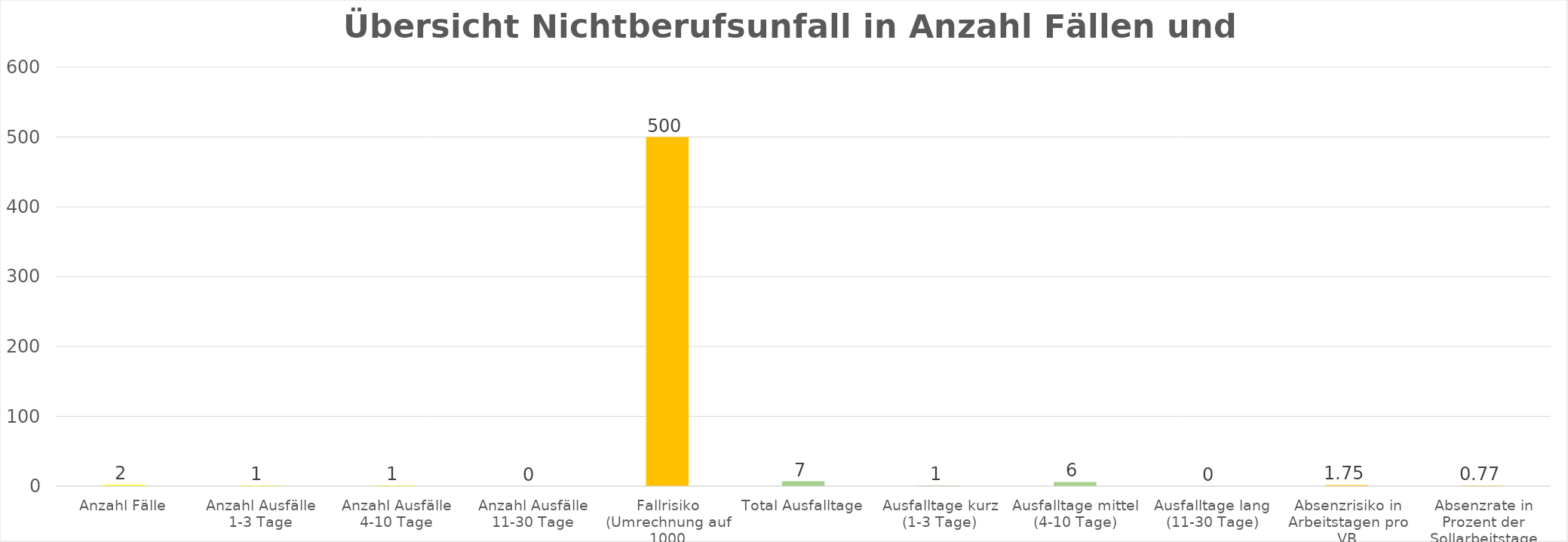
| Category | Nichtberufsunfall  |
|---|---|
| Anzahl Fälle | 2 |
| Anzahl Ausfälle 1-3 Tage | 1 |
| Anzahl Ausfälle 4-10 Tage | 1 |
| Anzahl Ausfälle 11-30 Tage | 0 |
| Fallrisiko (Umrechnung auf 1000 Vollbeschäftigte) | 500 |
| Total Ausfalltage | 7 |
| Ausfalltage kurz (1-3 Tage) | 1 |
| Ausfalltage mittel (4-10 Tage) | 6 |
| Ausfalltage lang (11-30 Tage) | 0 |
| Absenzrisiko in Arbeitstagen pro VB | 1.75 |
| Absenzrate in Prozent der Sollarbeitstage | 0.774 |